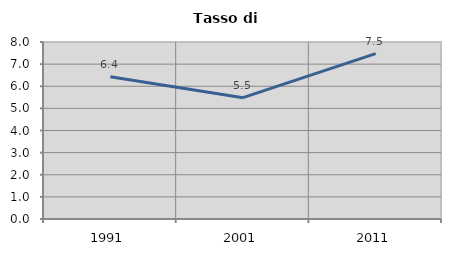
| Category | Tasso di disoccupazione   |
|---|---|
| 1991.0 | 6.431 |
| 2001.0 | 5.483 |
| 2011.0 | 7.476 |